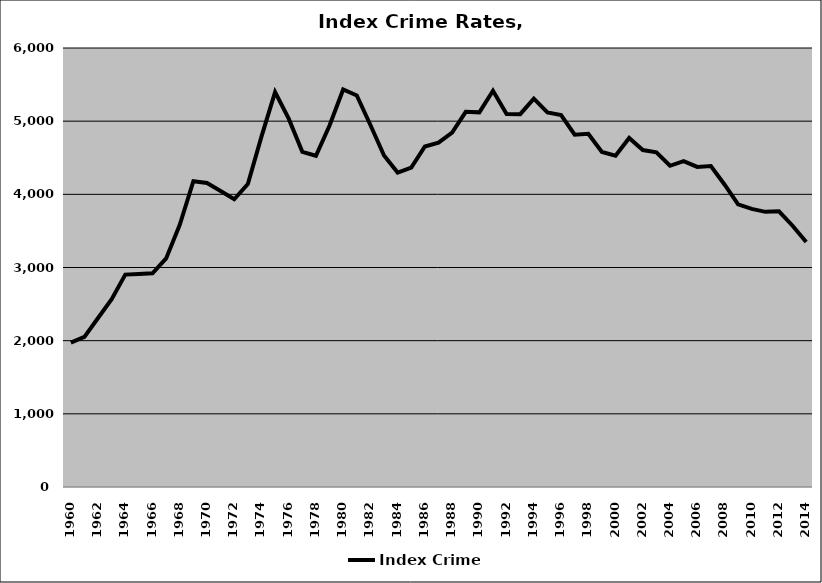
| Category | Index Crime |
|---|---|
| 1960.0 | 1972.562 |
| 1961.0 | 2051.827 |
| 1962.0 | 2309.158 |
| 1963.0 | 2565.712 |
| 1964.0 | 2903.357 |
| 1965.0 | 2912.253 |
| 1966.0 | 2920.319 |
| 1967.0 | 3123.724 |
| 1968.0 | 3584.158 |
| 1969.0 | 4179.166 |
| 1970.0 | 4154.659 |
| 1971.0 | 4045.567 |
| 1972.0 | 3933.242 |
| 1973.0 | 4141.434 |
| 1974.0 | 4788.068 |
| 1975.0 | 5397.817 |
| 1976.0 | 5034.052 |
| 1977.0 | 4581.254 |
| 1978.0 | 4527.387 |
| 1979.0 | 4939.832 |
| 1980.0 | 5433.102 |
| 1981.0 | 5351.357 |
| 1982.0 | 4947.809 |
| 1983.0 | 4529.899 |
| 1984.0 | 4297.005 |
| 1985.0 | 4366.037 |
| 1986.0 | 4654.027 |
| 1987.0 | 4707.466 |
| 1988.0 | 4844.736 |
| 1989.0 | 5127.118 |
| 1990.0 | 5120.584 |
| 1991.0 | 5415.665 |
| 1992.0 | 5097.131 |
| 1993.0 | 5095.415 |
| 1994.0 | 5307.654 |
| 1995.0 | 5120.53 |
| 1996.0 | 5083.971 |
| 1997.0 | 4814.532 |
| 1998.0 | 4826.365 |
| 1999.0 | 4578.411 |
| 2000.0 | 4527.765 |
| 2001.0 | 4769.705 |
| 2002.0 | 4604.903 |
| 2003.0 | 4574.605 |
| 2004.0 | 4390.2 |
| 2005.0 | 4454.971 |
| 2006.0 | 4374.372 |
| 2007.0 | 4387.764 |
| 2008.0 | 4134.858 |
| 2009.0 | 3862.93 |
| 2010.0 | 3801.449 |
| 2011.0 | 3760.586 |
| 2012.0 | 3767.967 |
| 2013.0 | 3571.116 |
| 2014.0 | 3349.386 |